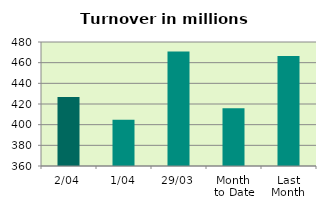
| Category | Series 0 |
|---|---|
| 2/04 | 426.841 |
| 1/04 | 404.812 |
| 29/03 | 470.811 |
| Month 
to Date | 415.827 |
| Last
Month | 466.511 |